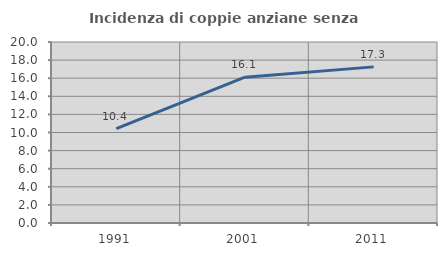
| Category | Incidenza di coppie anziane senza figli  |
|---|---|
| 1991.0 | 10.423 |
| 2001.0 | 16.111 |
| 2011.0 | 17.251 |